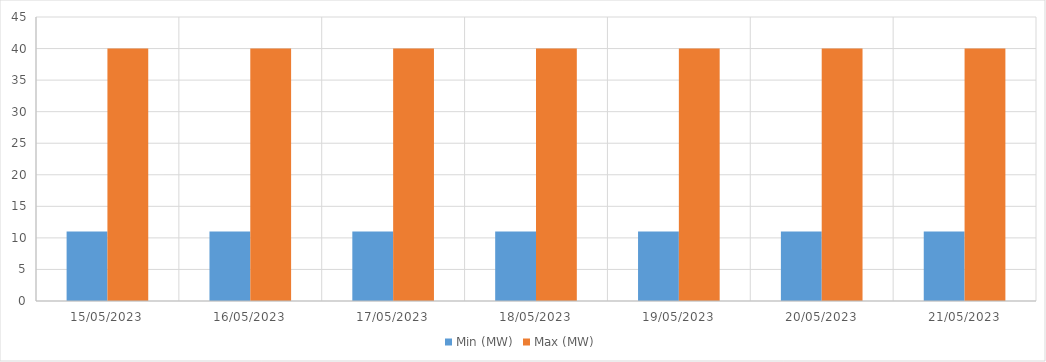
| Category | Min (MW) | Max (MW) |
|---|---|---|
| 15/05/2023 | 11 | 40 |
| 16/05/2023 | 11 | 40 |
| 17/05/2023 | 11 | 40 |
| 18/05/2023 | 11 | 40 |
| 19/05/2023 | 11 | 40 |
| 20/05/2023 | 11 | 40 |
| 21/05/2023 | 11 | 40 |